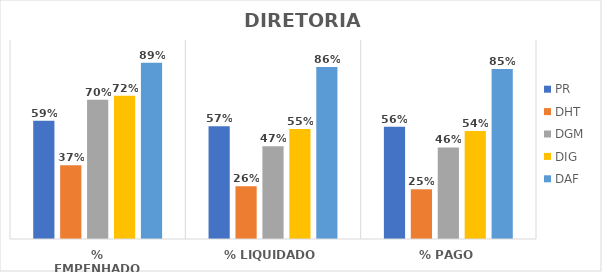
| Category | PR | DHT | DGM | DIG | DAF |
|---|---|---|---|---|---|
| % EMPENHADO | 0.595 | 0.371 | 0.699 | 0.72 | 0.885 |
| % LIQUIDADO | 0.567 | 0.265 | 0.466 | 0.553 | 0.864 |
| % PAGO | 0.564 | 0.251 | 0.46 | 0.542 | 0.854 |